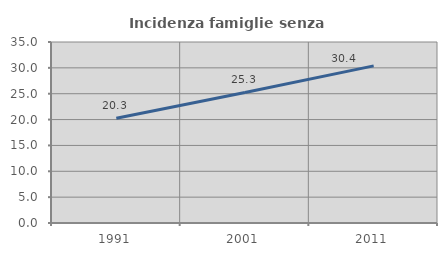
| Category | Incidenza famiglie senza nuclei |
|---|---|
| 1991.0 | 20.27 |
| 2001.0 | 25.25 |
| 2011.0 | 30.378 |